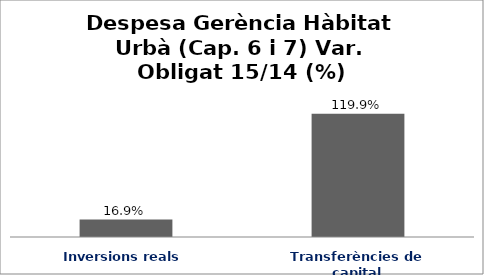
| Category | Series 0 |
|---|---|
| Inversions reals | 0.169 |
| Transferències de capital | 1.199 |